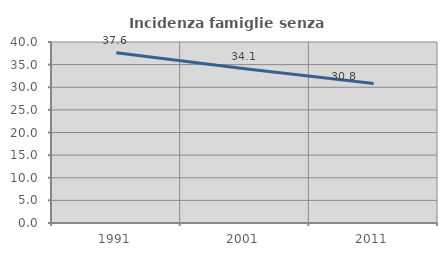
| Category | Incidenza famiglie senza nuclei |
|---|---|
| 1991.0 | 37.615 |
| 2001.0 | 34.112 |
| 2011.0 | 30.806 |